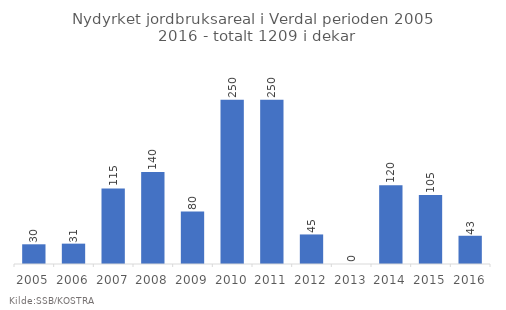
| Category | Totalt |
|---|---|
| 2005 | 30 |
| 2006 | 31 |
| 2007 | 115 |
| 2008 | 140 |
| 2009 | 80 |
| 2010 | 250 |
| 2011 | 250 |
| 2012 | 45 |
| 2013 | 0 |
| 2014 | 120 |
| 2015 | 105 |
| 2016 | 43 |